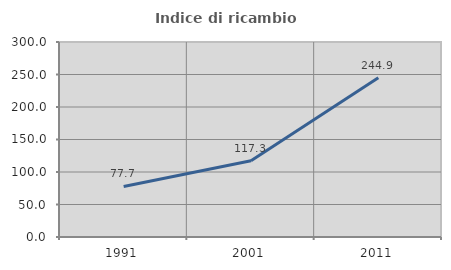
| Category | Indice di ricambio occupazionale  |
|---|---|
| 1991.0 | 77.713 |
| 2001.0 | 117.331 |
| 2011.0 | 244.937 |